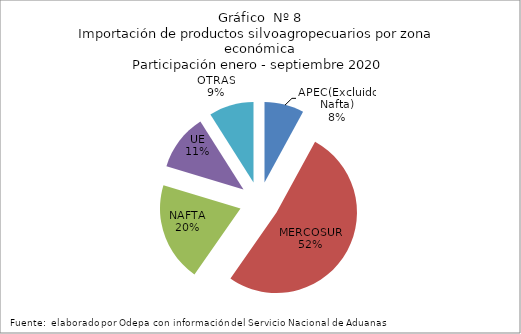
| Category | Series 0 |
|---|---|
| APEC(Excluido Nafta) | 374898.615 |
| MERCOSUR | 2437722.912 |
| NAFTA | 941750.946 |
| UE | 533507.326 |
| OTRAS | 423886.2 |